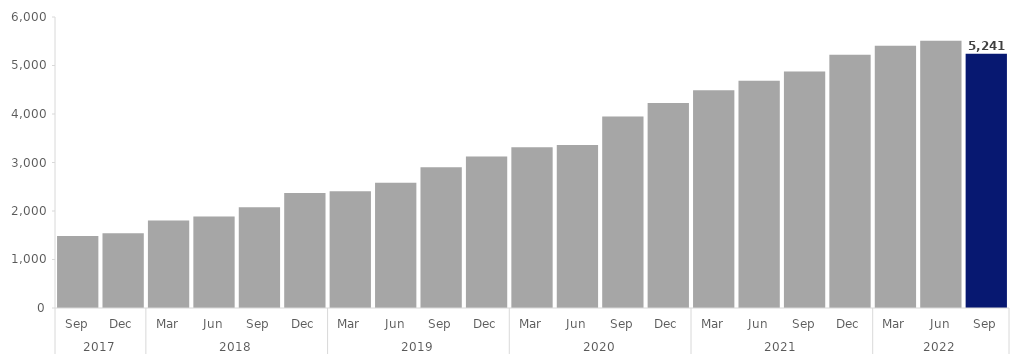
| Category | Series 0 |
|---|---|
| 0 | 1482 |
| 1 | 1542 |
| 2 | 1806 |
| 3 | 1887 |
| 4 | 2076 |
| 5 | 2373 |
| 6 | 2406 |
| 7 | 2580 |
| 8 | 2901 |
| 9 | 3126 |
| 10 | 3312 |
| 11 | 3360 |
| 12 | 3948 |
| 13 | 4227 |
| 14 | 4488 |
| 15 | 4686 |
| 16 | 4875 |
| 17 | 5223 |
| 18 | 5409 |
| 19 | 5511 |
| 20 | 5241 |